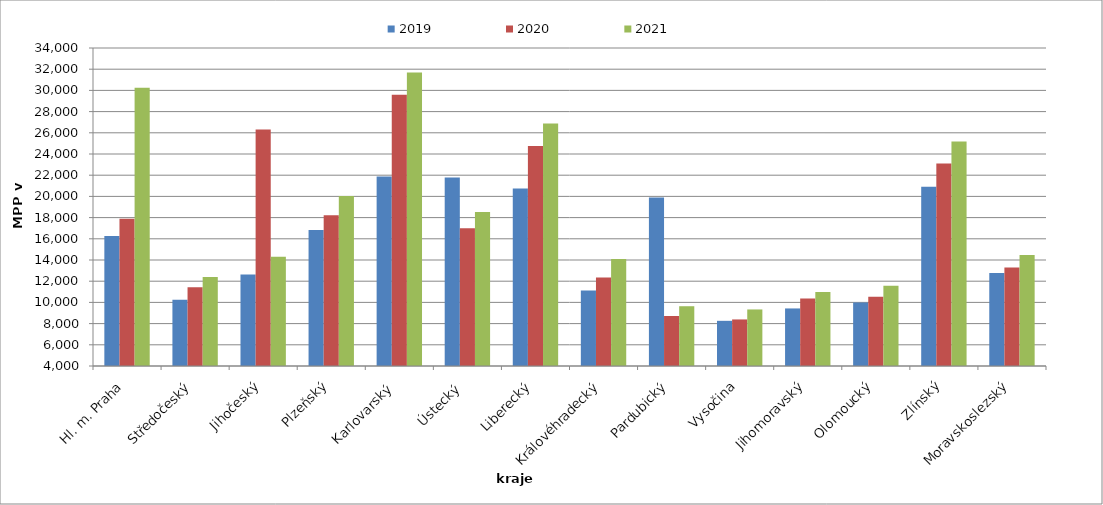
| Category | 2019 | 2020 | 2021 |
|---|---|---|---|
| Hl. m. Praha | 16270.857 | 17896.127 | 30242.815 |
| Středočeský | 10258.571 | 11437.714 | 12393.089 |
| Jihočeský | 12622.089 | 26312.105 | 14307.025 |
| Plzeňský | 16822.43 | 18211.134 | 20032.345 |
| Karlovarský  | 21866.667 | 29600 | 31680 |
| Ústecký   | 21777.804 | 17000.435 | 18530.318 |
| Liberecký | 20738.479 | 24745.275 | 26885.263 |
| Královéhradecký | 11131.628 | 12356.255 | 14086.59 |
| Pardubický | 19888.37 | 8717.297 | 9638.914 |
| Vysočina | 8262.15 | 8392.495 | 9334.496 |
| Jihomoravský | 9430.197 | 10375.491 | 10981.179 |
| Olomoucký | 9991.642 | 10529.429 | 11582.286 |
| Zlínský | 20900.288 | 23096.467 | 25185.836 |
| Moravskoslezský | 12771.776 | 13284.552 | 14476.756 |